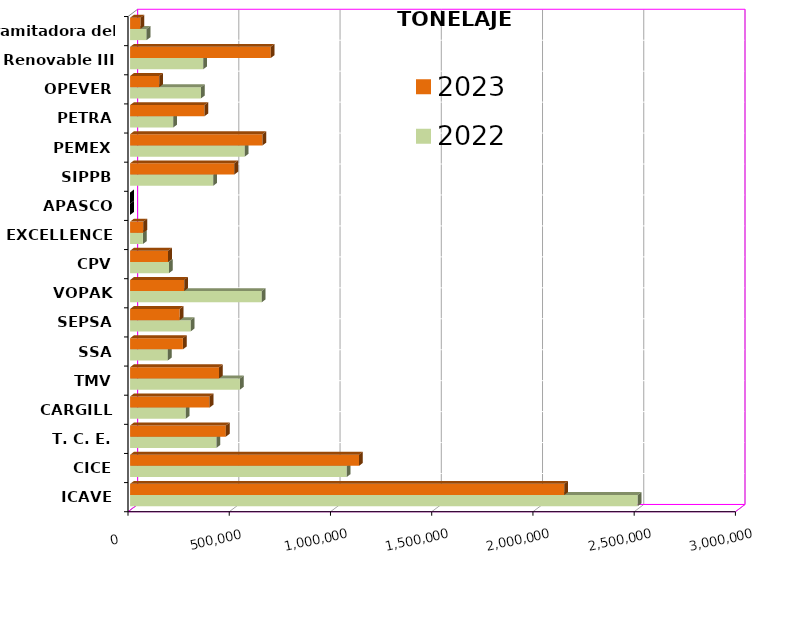
| Category | 2022 | 2023 |
|---|---|---|
| ICAVE | 2507176.77 | 2144509.26 |
| CICE | 1069640.32 | 1130651.484 |
| T. C. E. | 426333.878 | 472750.241 |
| CARGILL | 274527.02 | 392726.28 |
| TMV | 542612.01 | 439191.63 |
| SSA | 186354.865 | 260836.591 |
| SEPSA | 299312.87 | 244777.7 |
| VOPAK | 650392.869 | 266906.524 |
| CPV | 192127.17 | 187560.276 |
| EXCELLENCE | 63294.01 | 65388.166 |
| APASCO | 0 | 0 |
| SIPPB | 410915.753 | 514834.958 |
| PEMEX | 566251.09 | 654095.262 |
| PETRA | 213254.64 | 367420.873 |
| OPEVER | 350271.612 | 143954.41 |
| ESJ Renovable III | 361438.004 | 694596.035 |
| Tramitadora del Pac. | 81627.448 | 51313.584 |